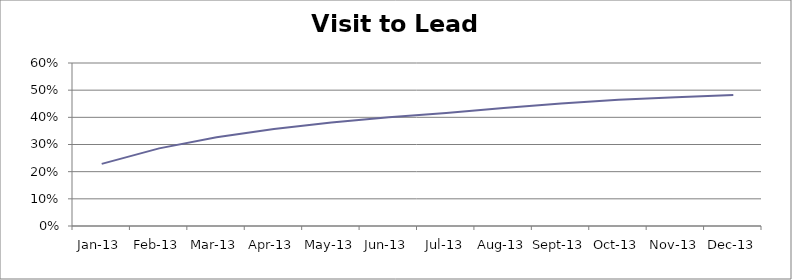
| Category | Visit to Lead % |
|---|---|
| 2013-01-13 | 0.229 |
| 2013-02-13 | 0.286 |
| 2013-03-13 | 0.327 |
| 2013-04-13 | 0.357 |
| 2013-05-13 | 0.381 |
| 2013-06-13 | 0.4 |
| 2013-07-13 | 0.416 |
| 2013-08-13 | 0.435 |
| 2013-09-13 | 0.451 |
| 2013-10-13 | 0.464 |
| 2013-11-13 | 0.474 |
| 2013-12-13 | 0.482 |